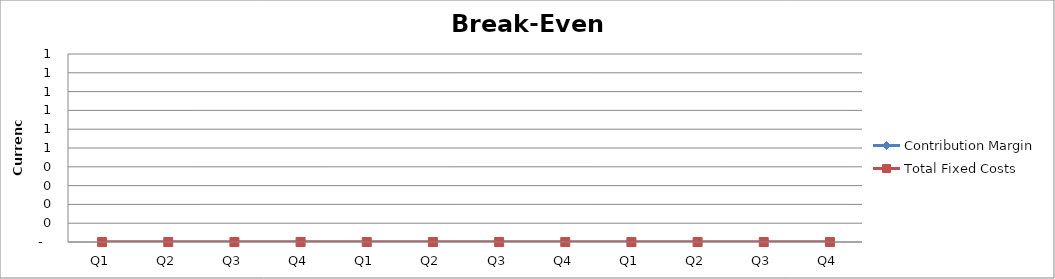
| Category | Contribution Margin | Total Fixed Costs |
|---|---|---|
| Q1 | 0 | 0 |
| Q2 | 0 | 0 |
| Q3 | 0 | 0 |
| Q4 | 0 | 0 |
| Q1 | 0 | 0 |
| Q2 | 0 | 0 |
| Q3 | 0 | 0 |
| Q4 | 0 | 0 |
| Q1 | 0 | 0 |
| Q2 | 0 | 0 |
| Q3 | 0 | 0 |
| Q4 | 0 | 0 |